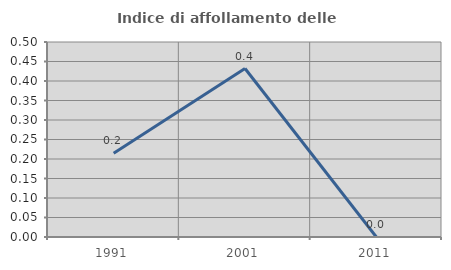
| Category | Indice di affollamento delle abitazioni  |
|---|---|
| 1991.0 | 0.215 |
| 2001.0 | 0.432 |
| 2011.0 | 0 |